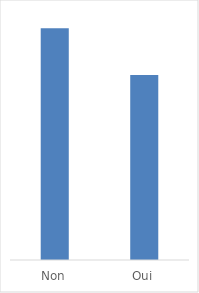
| Category | Series 0 |
|---|---|
| Non | 0.556 |
| Oui | 0.444 |